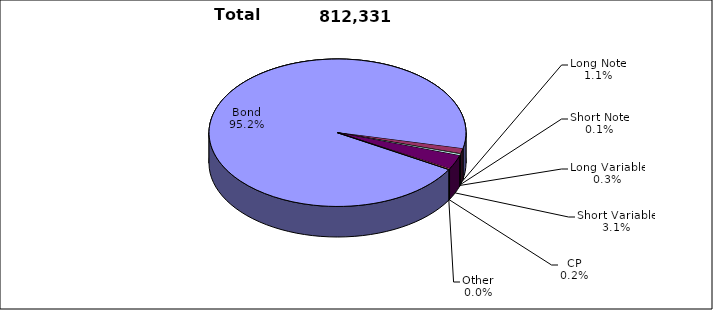
| Category | Trades |
|---|---|
| Bond | 773016 |
| Long Note | 8936 |
| Short Note | 795 |
| Long Variable | 2729 |
| Short Variable | 25314 |
| CP | 1424 |
| Other | 117 |